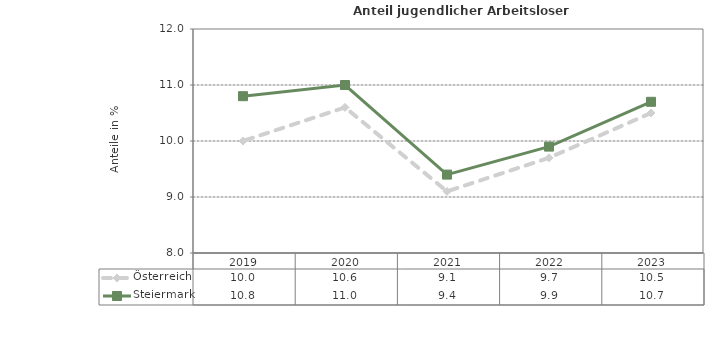
| Category | Österreich | Steiermark |
|---|---|---|
| 2023.0 | 10.5 | 10.7 |
| 2022.0 | 9.7 | 9.9 |
| 2021.0 | 9.1 | 9.4 |
| 2020.0 | 10.6 | 11 |
| 2019.0 | 10 | 10.8 |